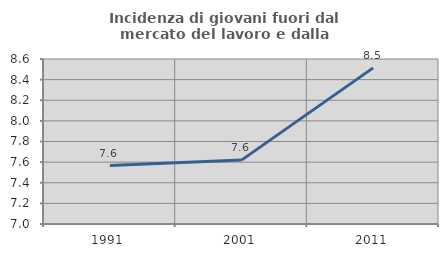
| Category | Incidenza di giovani fuori dal mercato del lavoro e dalla formazione  |
|---|---|
| 1991.0 | 7.567 |
| 2001.0 | 7.619 |
| 2011.0 | 8.514 |